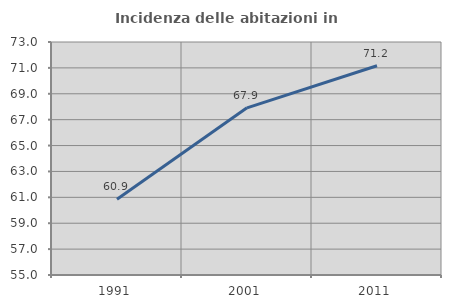
| Category | Incidenza delle abitazioni in proprietà  |
|---|---|
| 1991.0 | 60.854 |
| 2001.0 | 67.914 |
| 2011.0 | 71.166 |